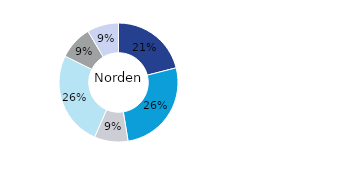
| Category | Norden |
|---|---|
| Kontor | 0.21 |
| Bostäder | 0.264 |
| Handel | 0.092 |
| Logistik* | 0.257 |
| Samhällsfastigheter | 0.091 |
| Övrigt | 0.086 |